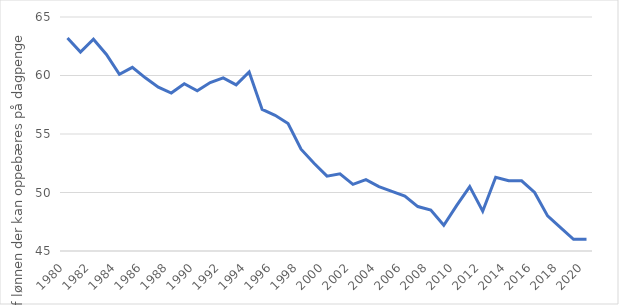
| Category | Series 0 |
|---|---|
| 1980.0 | 63.2 |
| 1981.0 | 62 |
| 1982.0 | 63.1 |
| 1983.0 | 61.8 |
| 1984.0 | 60.1 |
| 1985.0 | 60.7 |
| 1986.0 | 59.8 |
| 1987.0 | 59 |
| 1988.0 | 58.5 |
| 1989.0 | 59.3 |
| 1990.0 | 58.7 |
| 1991.0 | 59.4 |
| 1992.0 | 59.8 |
| 1993.0 | 59.2 |
| 1994.0 | 60.3 |
| 1995.0 | 57.1 |
| 1996.0 | 56.6 |
| 1997.0 | 55.9 |
| 1998.0 | 53.7 |
| 1999.0 | 52.5 |
| 2000.0 | 51.4 |
| 2001.0 | 51.6 |
| 2002.0 | 50.7 |
| 2003.0 | 51.1 |
| 2004.0 | 50.5 |
| 2005.0 | 50.1 |
| 2006.0 | 49.7 |
| 2007.0 | 48.8 |
| 2008.0 | 48.5 |
| 2009.0 | 47.2 |
| 2010.0 | 48.9 |
| 2011.0 | 50.5 |
| 2012.0 | 48.4 |
| 2013.0 | 51.3 |
| 2014.0 | 51 |
| 2015.0 | 51 |
| 2016.0 | 50 |
| 2017.0 | 48 |
| 2018.0 | 47 |
| 2019.0 | 46 |
| 2020.0 | 46 |